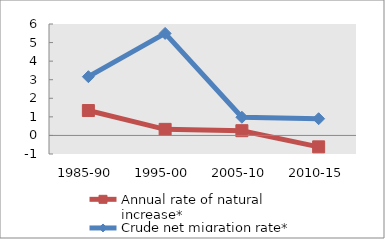
| Category | Annual rate of natural increase* | Crude net migration rate* |
|---|---|---|
| 1985-90 | 1.34 | 3.163 |
| 1995-00 | 0.326 | 5.493 |
| 2005-10 | 0.255 | 0.979 |
| 2010-15 | -0.615 | 0.899 |